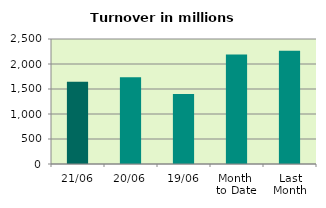
| Category | Series 0 |
|---|---|
| 21/06 | 1644.228 |
| 20/06 | 1732.527 |
| 19/06 | 1400.376 |
| Month 
to Date | 2190.425 |
| Last
Month | 2265.206 |